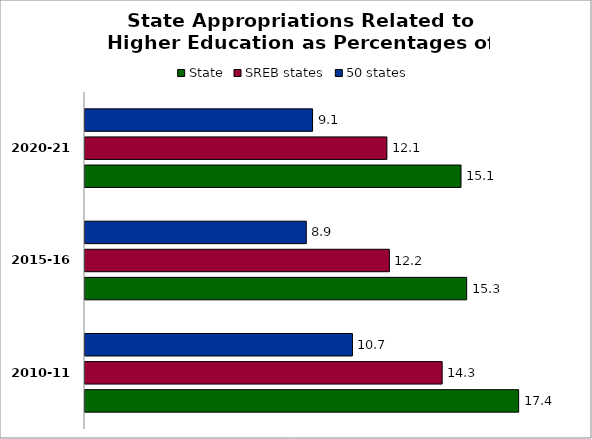
| Category | State | SREB states | 50 states |
|---|---|---|---|
| 2010-11 | 17.415 | 14.344 | 10.741 |
| 2015-16 | 15.328 | 12.224 | 8.887 |
| 2020-21 | 15.101 | 12.125 | 9.139 |